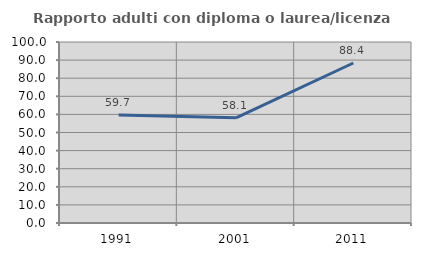
| Category | Rapporto adulti con diploma o laurea/licenza media  |
|---|---|
| 1991.0 | 59.701 |
| 2001.0 | 58.14 |
| 2011.0 | 88.398 |